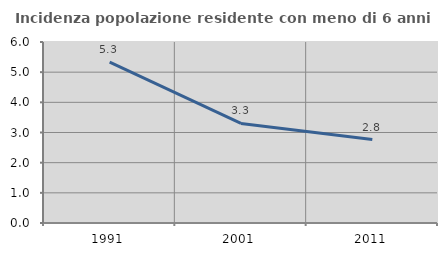
| Category | Incidenza popolazione residente con meno di 6 anni |
|---|---|
| 1991.0 | 5.331 |
| 2001.0 | 3.299 |
| 2011.0 | 2.765 |